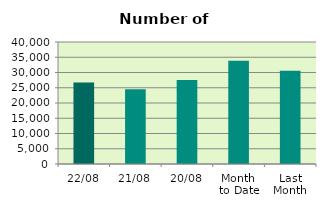
| Category | Series 0 |
|---|---|
| 22/08 | 26682 |
| 21/08 | 24482 |
| 20/08 | 27506 |
| Month 
to Date | 33815.375 |
| Last
Month | 30613.13 |